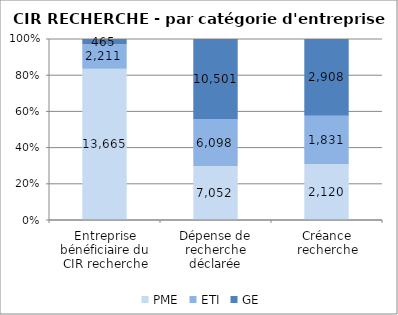
| Category | PME | ETI | GE |
|---|---|---|---|
| Entreprise bénéficiaire du CIR recherche | 13665 | 2211 | 465 |
| Dépense de recherche déclarée | 7052.43 | 6098.04 | 10501.48 |
| Créance recherche | 2120.25 | 1831.2 | 2908.02 |